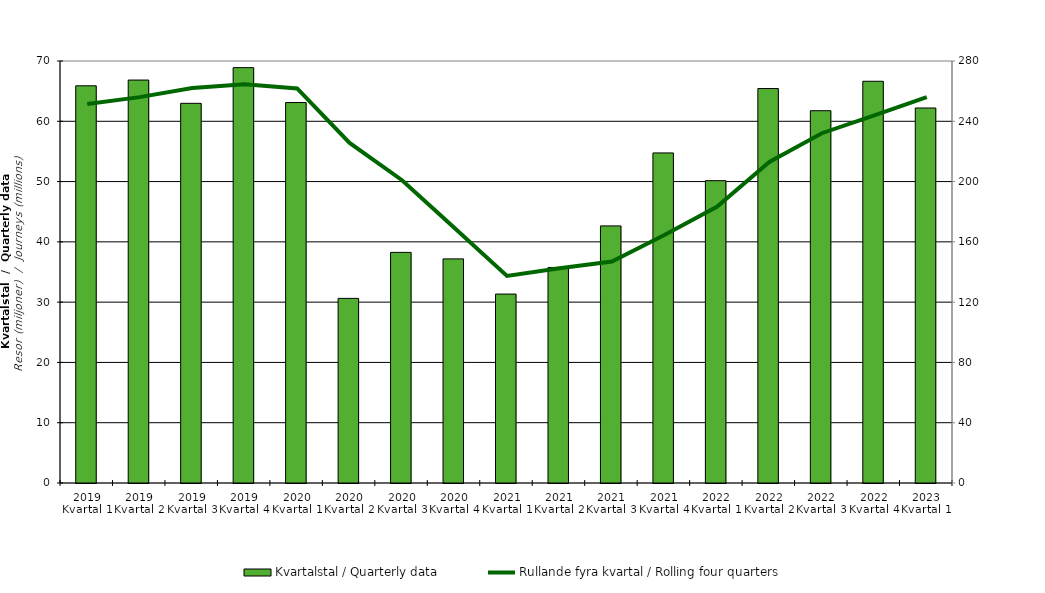
| Category | Kvartalstal / Quarterly data |
|---|---|
| 2019 Kvartal 1 | 65.885 |
| 2019 Kvartal 2 | 66.84 |
| 2019 Kvartal 3 | 62.979 |
| 2019 Kvartal 4 | 68.898 |
| 2020 Kvartal 1 | 63.109 |
| 2020 Kvartal 2 | 30.624 |
| 2020 Kvartal 3 | 38.255 |
| 2020 Kvartal 4 | 37.175 |
| 2021 Kvartal 1 | 31.339 |
| 2021 Kvartal 2 | 35.757 |
| 2021 Kvartal 3 | 42.645 |
| 2021 Kvartal 4 | 54.75 |
| 2022 Kvartal 1 | 50.15 |
| 2022 Kvartal 2 | 65.43 |
| 2022 Kvartal 3 | 61.753 |
| 2022 Kvartal 4 | 66.639 |
| 2023 Kvartal 1 | 62.204 |